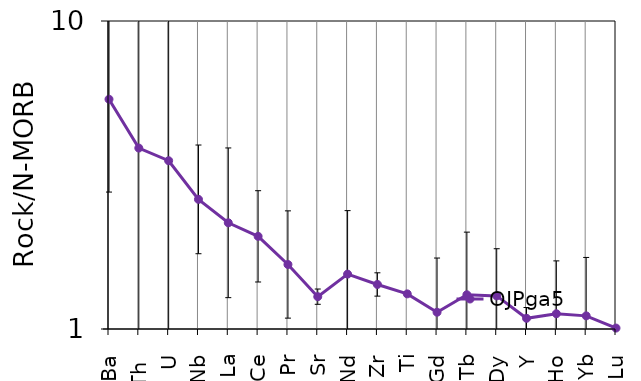
| Category | OJPga5 |
|---|---|
| Ba | 5.572 |
| Th  | 3.868 |
| U | 3.519 |
| Nb | 2.636 |
| La | 2.212 |
| Ce | 1.999 |
| Pr | 1.62 |
| Sr | 1.274 |
| Nd | 1.507 |
| Zr | 1.395 |
| Ti | 1.3 |
| Gd | 1.134 |
| Tb | 1.292 |
| Dy | 1.281 |
| Y | 1.083 |
| Ho | 1.121 |
| Yb | 1.103 |
| Lu | 1.007 |